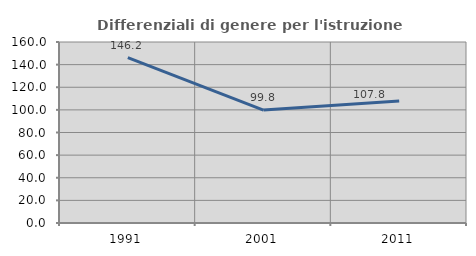
| Category | Differenziali di genere per l'istruzione superiore |
|---|---|
| 1991.0 | 146.241 |
| 2001.0 | 99.827 |
| 2011.0 | 107.798 |